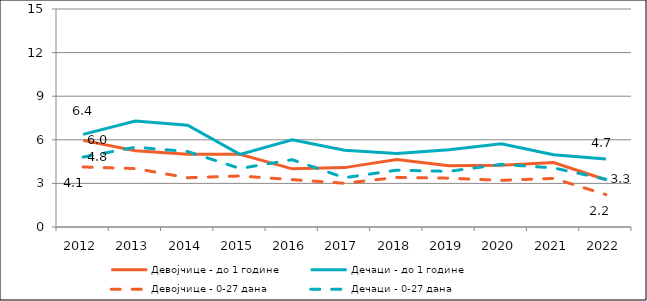
| Category | Девојчице - до 1 године | Дечаци - до 1 године | Девојчице - 0-27 дана | Дечаци - 0-27 дана |
|---|---|---|---|---|
| 2012.0 | 5.959 | 6.371 | 4.13 | 4.81 |
| 2013.0 | 5.244 | 7.298 | 4.02 | 5.49 |
| 2014.0 | 5 | 7 | 3.39 | 5.19 |
| 2015.0 | 5 | 5 | 3.51 | 4.03 |
| 2016.0 | 4 | 6 | 3.26 | 4.63 |
| 2017.0 | 4.086 | 5.282 | 3.01 | 3.39 |
| 2018.0 | 4.648 | 5.059 | 3.41 | 3.91 |
| 2019.0 | 4.222 | 5.311 | 3.36 | 3.83 |
| 2020.0 | 4.246 | 5.726 | 3.21 | 4.31 |
| 2021.0 | 4.436 | 4.973 | 3.343 | 4.066 |
| 2022.0 | 3.253 | 4.68 | 2.234 | 3.285 |